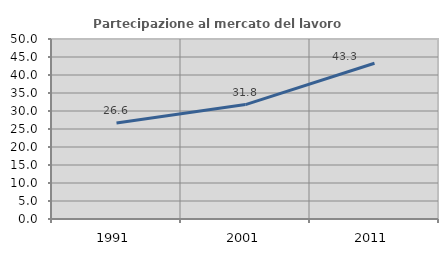
| Category | Partecipazione al mercato del lavoro  femminile |
|---|---|
| 1991.0 | 26.645 |
| 2001.0 | 31.777 |
| 2011.0 | 43.268 |